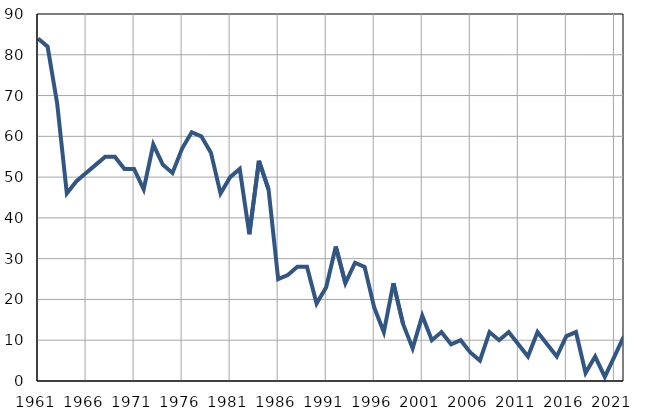
| Category | Infants
deaths |
|---|---|
| 1961.0 | 84 |
| 1962.0 | 82 |
| 1963.0 | 68 |
| 1964.0 | 46 |
| 1965.0 | 49 |
| 1966.0 | 51 |
| 1967.0 | 53 |
| 1968.0 | 55 |
| 1969.0 | 55 |
| 1970.0 | 52 |
| 1971.0 | 52 |
| 1972.0 | 47 |
| 1973.0 | 58 |
| 1974.0 | 53 |
| 1975.0 | 51 |
| 1976.0 | 57 |
| 1977.0 | 61 |
| 1978.0 | 60 |
| 1979.0 | 56 |
| 1980.0 | 46 |
| 1981.0 | 50 |
| 1982.0 | 52 |
| 1983.0 | 36 |
| 1984.0 | 54 |
| 1985.0 | 47 |
| 1986.0 | 25 |
| 1987.0 | 26 |
| 1988.0 | 28 |
| 1989.0 | 28 |
| 1990.0 | 19 |
| 1991.0 | 23 |
| 1992.0 | 33 |
| 1993.0 | 24 |
| 1994.0 | 29 |
| 1995.0 | 28 |
| 1996.0 | 18 |
| 1997.0 | 12 |
| 1998.0 | 24 |
| 1999.0 | 14 |
| 2000.0 | 8 |
| 2001.0 | 16 |
| 2002.0 | 10 |
| 2003.0 | 12 |
| 2004.0 | 9 |
| 2005.0 | 10 |
| 2006.0 | 7 |
| 2007.0 | 5 |
| 2008.0 | 12 |
| 2009.0 | 10 |
| 2010.0 | 12 |
| 2011.0 | 9 |
| 2012.0 | 6 |
| 2013.0 | 12 |
| 2014.0 | 9 |
| 2015.0 | 6 |
| 2016.0 | 11 |
| 2017.0 | 12 |
| 2018.0 | 2 |
| 2019.0 | 6 |
| 2020.0 | 1 |
| 2021.0 | 6 |
| 2022.0 | 11 |